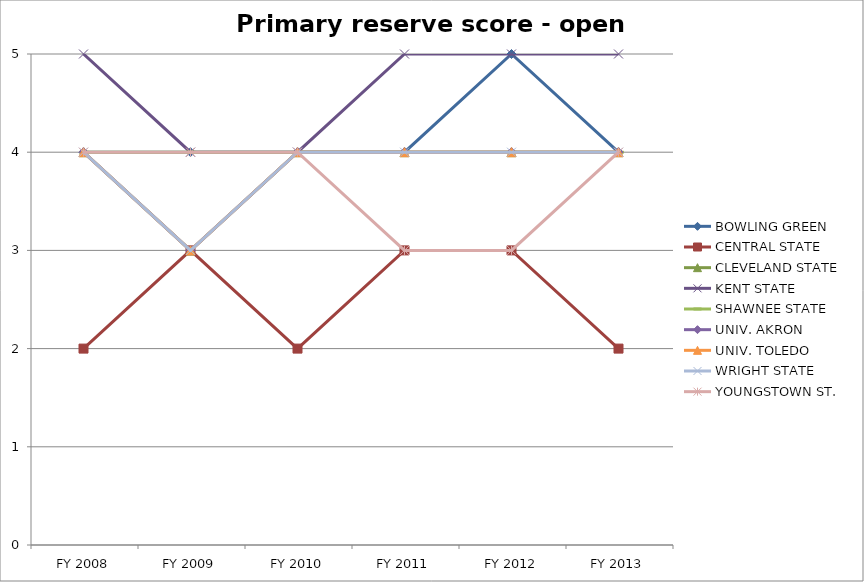
| Category | BOWLING GREEN  | CENTRAL STATE  | CLEVELAND STATE  | KENT STATE  | SHAWNEE STATE  | UNIV. AKRON  | UNIV. TOLEDO  | WRIGHT STATE  | YOUNGSTOWN ST.  |
|---|---|---|---|---|---|---|---|---|---|
| FY 2013 | 4 | 2 | 4 | 5 | 4 | 4 | 4 | 4 | 4 |
| FY 2012 | 5 | 3 | 4 | 5 | 4 | 4 | 4 | 4 | 3 |
| FY 2011 | 4 | 3 | 4 | 5 | 4 | 4 | 4 | 4 | 3 |
| FY 2010 | 4 | 2 | 4 | 4 | 4 | 4 | 4 | 4 | 4 |
| FY 2009 | 4 | 3 | 3 | 4 | 4 | 3 | 3 | 3 | 4 |
| FY 2008 | 4 | 2 | 4 | 5 | 4 | 4 | 4 | 4 | 4 |